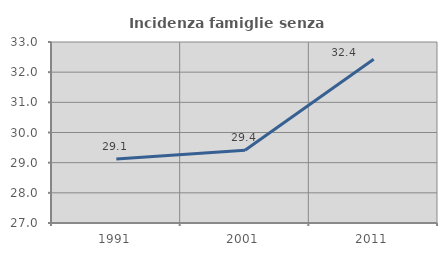
| Category | Incidenza famiglie senza nuclei |
|---|---|
| 1991.0 | 29.125 |
| 2001.0 | 29.412 |
| 2011.0 | 32.425 |